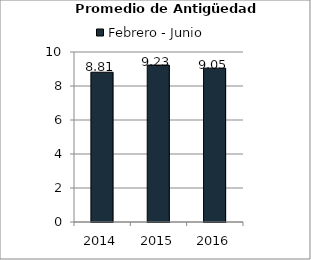
| Category | Febrero - Junio |
|---|---|
| 2014.0 | 8.81 |
| 2015.0 | 9.23 |
| 2016.0 | 9.05 |